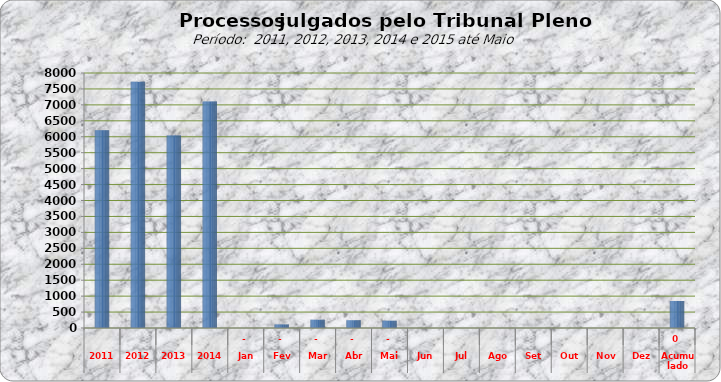
| Category | 6205 7722 6043  7.108  0 113 258 243 231 0 0 0 0 0 0 0 |
|---|---|
| 2011 | 6205 |
| 2012 | 7722 |
| 2013 | 6043 |
| 2014 | 7108 |
| Jan | 0 |
| Fev | 113 |
| Mar | 258 |
| Abr | 243 |
| Mai | 231 |
| Jun | 0 |
| Jul | 0 |
| Ago | 0 |
| Set | 0 |
| Out | 0 |
| Nov | 0 |
| Dez | 0 |
| Acumulado | 845 |